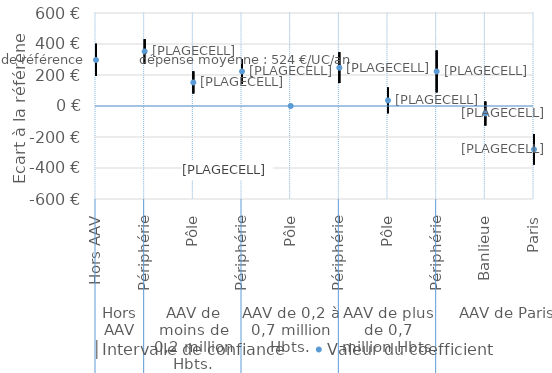
| Category | │Intervalle de confiance | Series 1 | Valeur du coefficient |
|---|---|---|---|
| 0 | 401 | 194 | 297 |
| 1 | 431 | 273 | 352 |
| 2 | 224 | 81 | 152 |
| 3 | 304 | 143 | 223 |
| 4 | 0 | 0 | 0 |
| 5 | 347 | 148 | 247 |
| 6 | 119 | -46 | 36 |
| 7 | 358 | 88 | 223 |
| 8 | 29 | -126 | -48 |
| 9 | -182 | -378 | -280 |